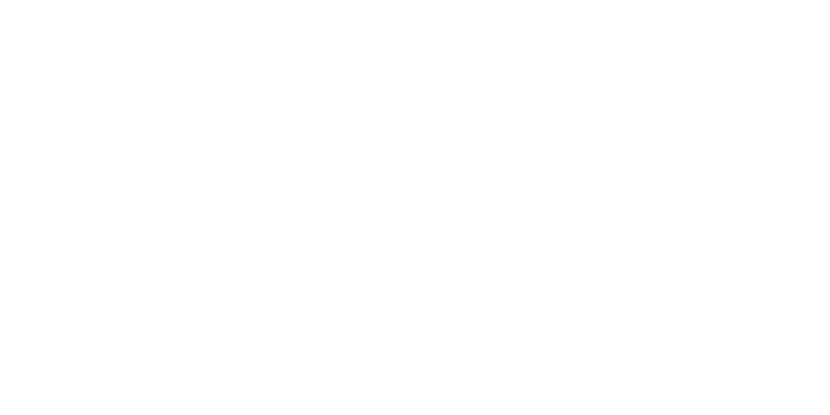
| Category | Total |
|---|---|
| Al Hodeidah | 79397 |
| Hajjah | 73160 |
| Marib | 52223 |
| Taiz | 16253 |
| Al Jawf | 12054 |
| Sadah | 7196 |
| Abyan | 7005 |
| Lahj | 5703 |
| Amran | 4829 |
| Sanaa | 3970 |
| Ad Dali | 3704 |
| Aden | 3596 |
| Hadramawt | 3216 |
| Ibb | 2676 |
| Dhamar | 2191 |
| Al Bayda | 1969 |
| Shabwah | 1188 |
| Al Mahwit | 680 |
| Raymah | 450 |
| Al Maharah | 368 |
| Sanaa City | 167 |
| Socotra | 15 |